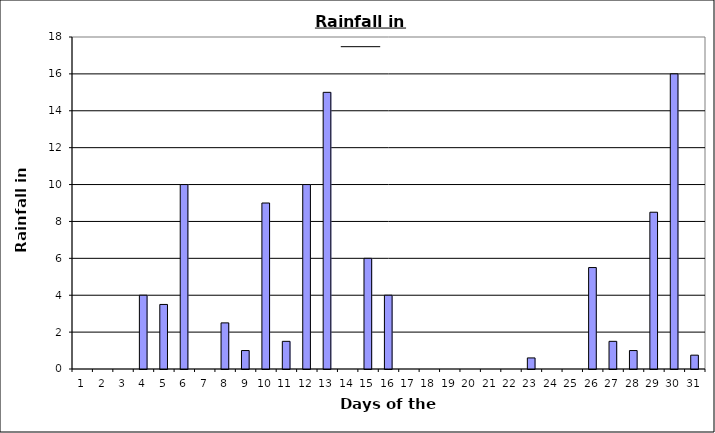
| Category | Series 0 |
|---|---|
| 0 | 0 |
| 1 | 0 |
| 2 | 0 |
| 3 | 4 |
| 4 | 3.5 |
| 5 | 10 |
| 6 | 0 |
| 7 | 2.5 |
| 8 | 1 |
| 9 | 9 |
| 10 | 1.5 |
| 11 | 10 |
| 12 | 15 |
| 13 | 0 |
| 14 | 6 |
| 15 | 4 |
| 16 | 0 |
| 17 | 0 |
| 18 | 0 |
| 19 | 0 |
| 20 | 0 |
| 21 | 0 |
| 22 | 0.6 |
| 23 | 0 |
| 24 | 0 |
| 25 | 5.5 |
| 26 | 1.5 |
| 27 | 1 |
| 28 | 8.5 |
| 29 | 16 |
| 30 | 0.75 |